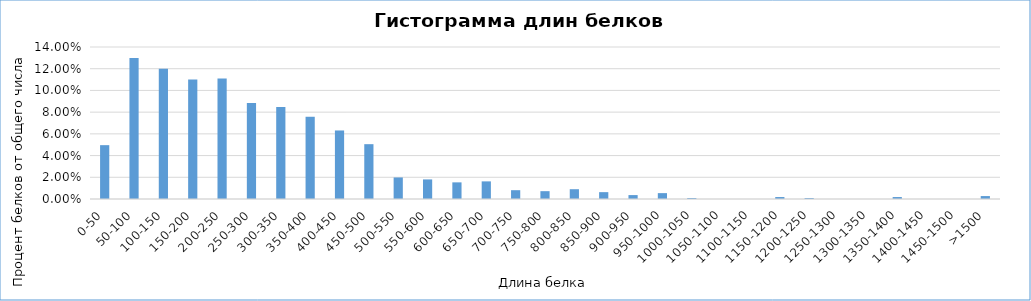
| Category | Series 0 |
|---|---|
| 0-50 | 0.05 |
| 50-100 | 0.13 |
| 100-150 | 0.12 |
| 150-200 | 0.11 |
| 200-250 | 0.111 |
| 250-300 | 0.088 |
| 300-350 | 0.085 |
| 350-400 | 0.076 |
| 400-450 | 0.063 |
| 450-500 | 0.05 |
| 500-550 | 0.02 |
| 550-600 | 0.018 |
| 600-650 | 0.015 |
| 650-700 | 0.016 |
| 700-750 | 0.008 |
| 750-800 | 0.007 |
| 800-850 | 0.009 |
| 850-900 | 0.006 |
| 900-950 | 0.004 |
| 950-1000 | 0.005 |
| 1000-1050 | 0.001 |
| 1050-1100 | 0 |
| 1100-1150 | 0 |
| 1150-1200 | 0.002 |
| 1200-1250 | 0.001 |
| 1250-1300 | 0 |
| 1300-1350 | 0 |
| 1350-1400 | 0.002 |
| 1400-1450 | 0 |
| 1450-1500 | 0 |
| >1500 | 0.003 |